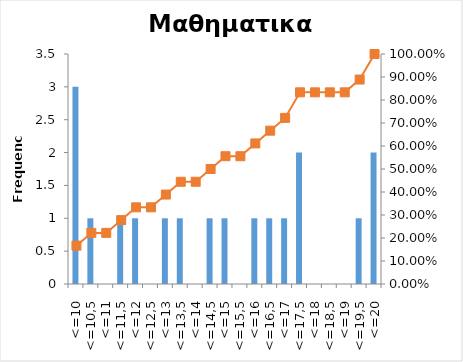
| Category | Series 0 |
|---|---|
| <=10 | 3 |
| <=10,5 | 1 |
| <=11 | 0 |
| <=11,5 | 1 |
| <=12 | 1 |
| <=12,5 | 0 |
| <=13 | 1 |
| <=13,5 | 1 |
| <=14 | 0 |
| <=14,5 | 1 |
| <=15 | 1 |
| <=15,5 | 0 |
| <=16 | 1 |
| <=16,5 | 1 |
| <=17 | 1 |
| <=17,5 | 2 |
| <=18 | 0 |
| <=18,5 | 0 |
| <=19 | 0 |
| <=19,5 | 1 |
| <=20 | 2 |